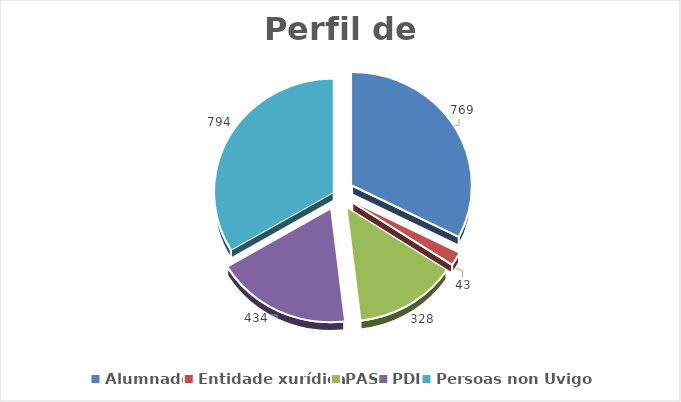
| Category | Series 0 |
|---|---|
| Alumnado | 769 |
| Entidade xurídica | 43 |
| PAS | 328 |
| PDI | 434 |
| Persoas non Uvigo | 794 |